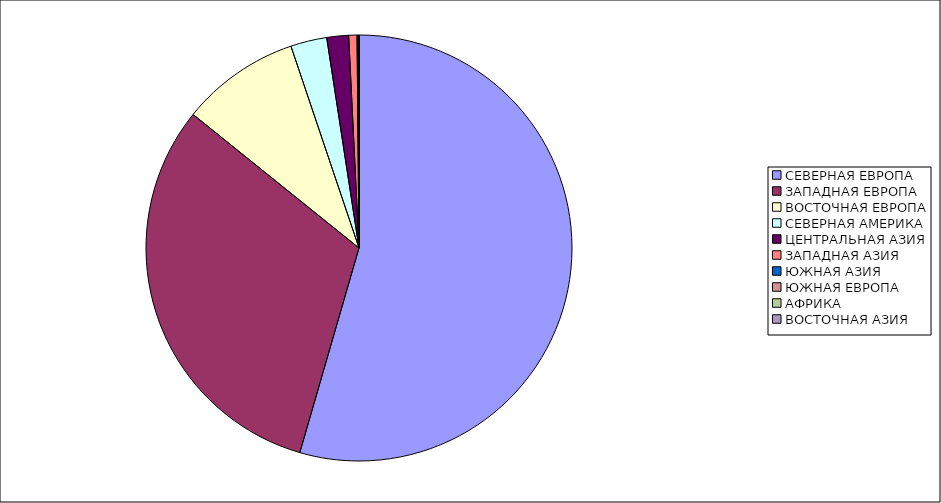
| Category | Оборот |
|---|---|
| СЕВЕРНАЯ ЕВРОПА | 54.483 |
| ЗАПАДНАЯ ЕВРОПА | 31.302 |
| ВОСТОЧНАЯ ЕВРОПА | 9.039 |
| СЕВЕРНАЯ АМЕРИКА | 2.751 |
| ЦЕНТРАЛЬНАЯ АЗИЯ | 1.652 |
| ЗАПАДНАЯ АЗИЯ | 0.628 |
| ЮЖНАЯ АЗИЯ | 0.079 |
| ЮЖНАЯ ЕВРОПА | 0.065 |
| АФРИКА | 0.002 |
| ВОСТОЧНАЯ АЗИЯ | 0.001 |